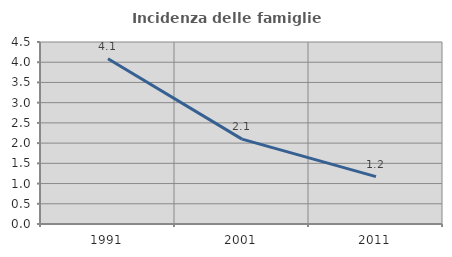
| Category | Incidenza delle famiglie numerose |
|---|---|
| 1991.0 | 4.086 |
| 2001.0 | 2.098 |
| 2011.0 | 1.171 |